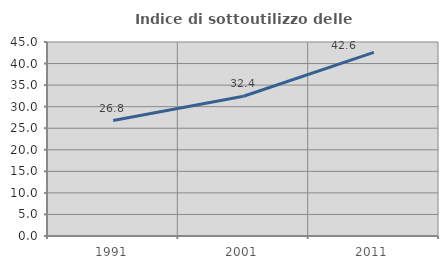
| Category | Indice di sottoutilizzo delle abitazioni  |
|---|---|
| 1991.0 | 26.786 |
| 2001.0 | 32.426 |
| 2011.0 | 42.607 |